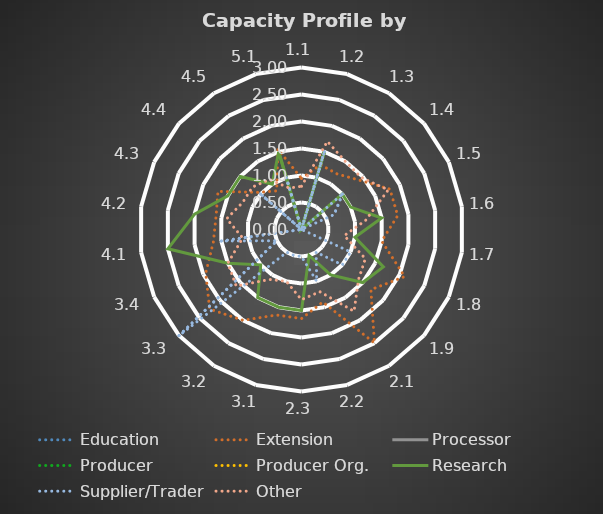
| Category | Education | Extension | Processor | Producer | Producer Org. | Research | Supplier/Trader | Other |
|---|---|---|---|---|---|---|---|---|
| 1.1 | 0 | 0.944 | 0 | 0 | 0 | 0 | 0 | 0.8 |
| 1.2 | 0 | 1.25 | 0 | 0 | 0 | 1.5 | 1.5 | 1.7 |
| 1.3 | 0 | 1.222 | 0 | 0 | 0 | 0 | 0 | 1.5 |
| 1.4 | 0 | 1.4 | 0 | 0 | 0 | 1 | 1 | 1.467 |
| 1.5 | 0 | 1.8 | 0 | 0 | 0 | 1 | 0.667 | 1.767 |
| 1.6 | 0 | 1.8 | 0 | 0 | 0 | 1.5 | 0 | 1.2 |
| 1.7 | 0 | 1.5 | 0 | 0 | 0 | 1 | 0 | 0.8 |
| 1.8 | 0 | 2.1 | 0 | 0 | 0 | 1.667 | 1 | 1.3 |
| 1.9 | 0 | 1.7 | 0 | 0 | 0 | 1.5 | 1 | 1.4 |
| 2.1 | 0 | 2.5 | 0 | 0 | 0 | 1 | 0.5 | 1.8 |
| 2.2 | 0 | 1.4 | 0 | 0 | 0 | 0.5 | 1 | 1.2 |
| 2.3 | 0 | 1.65 | 0 | 0 | 0 | 1.5 | 0.5 | 1.3 |
| 3.1 | 0 | 1.65 | 0 | 0 | 0 | 1.5 | 0.5 | 1 |
| 3.2 | 0 | 2 | 0 | 0 | 0 | 1.5 | 0.5 | 1.1 |
| 3.3 | 0 | 2.25 | 0 | 0 | 0 | 1 | 3 | 1.6 |
| 3.4 | 0 | 1.95 | 0 | 0 | 0 | 1.5 | 0.5 | 1.5 |
| 4.1 | 0 | 1.65 | 0 | 0 | 0 | 2.5 | 1.5 | 1.1 |
| 4.2 | 0 | 1.6 | 0 | 0 | 0 | 2 | 0 | 1.4 |
| 4.3 | 0 | 1.7 | 0 | 0 | 0 | 1.5 | 0 | 1.2 |
| 4.4 | 0 | 1.05 | 0 | 0 | 0 | 1.5 | 1 | 1.2 |
| 4.5 | 0 | 0.85 | 0 | 0 | 0 | 1 | 0 | 1.1 |
| 5.1 | 0 | 1.55 | 0 | 0 | 0 | 1.5 | 1 | 0.8 |